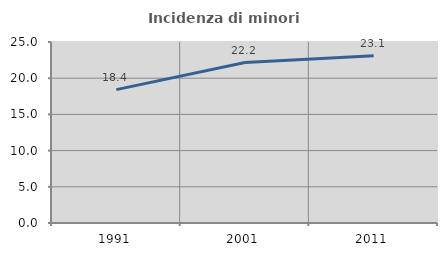
| Category | Incidenza di minori stranieri |
|---|---|
| 1991.0 | 18.421 |
| 2001.0 | 22.156 |
| 2011.0 | 23.111 |